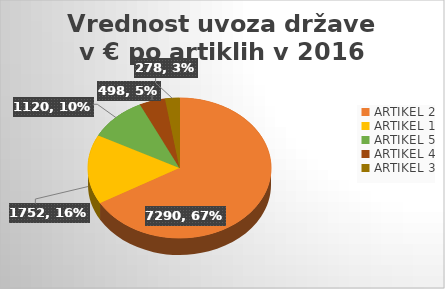
| Category | Series 0 |
|---|---|
| ARTIKEL 2 | 7290 |
| ARTIKEL 1 | 1752 |
| ARTIKEL 5 | 1120 |
| ARTIKEL 4 | 497.5 |
| ARTIKEL 3 | 278.32 |